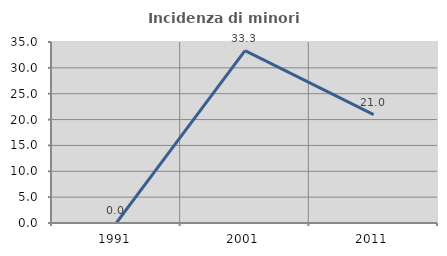
| Category | Incidenza di minori stranieri |
|---|---|
| 1991.0 | 0 |
| 2001.0 | 33.333 |
| 2011.0 | 20.968 |